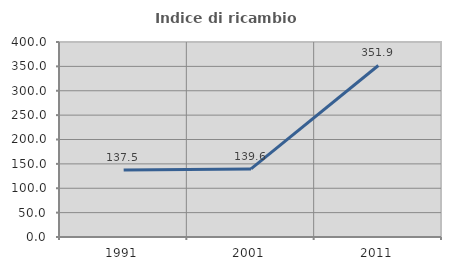
| Category | Indice di ricambio occupazionale  |
|---|---|
| 1991.0 | 137.5 |
| 2001.0 | 139.623 |
| 2011.0 | 351.852 |